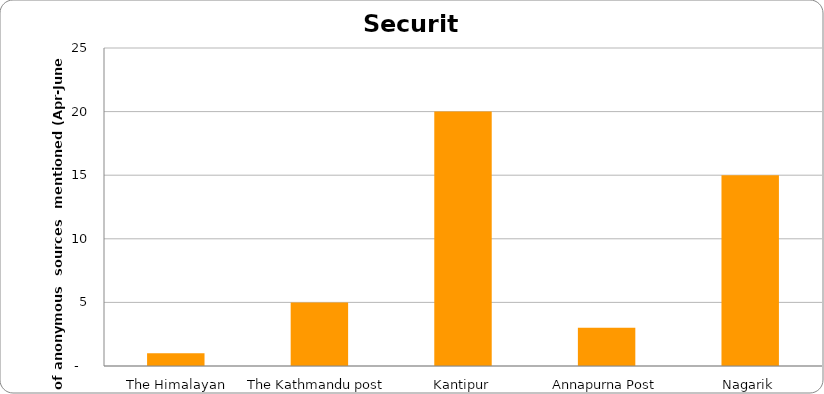
| Category | Security |
|---|---|
| The Himalayan Times | 1 |
| The Kathmandu post | 5 |
| Kantipur | 20 |
| Annapurna Post | 3 |
| Nagarik | 15 |